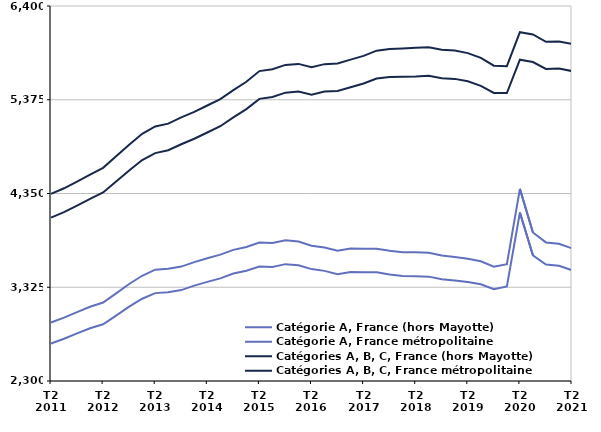
| Category | Catégorie A, France (hors Mayotte) | Catégorie A, France métropolitaine | Catégories A, B, C, France (hors Mayotte) | Catégories A, B, C, France métropolitaine |
|---|---|---|---|---|
| T2
2011 | 2939 | 2710.3 | 4345.1 | 4086.7 |
| T3
2011 | 2992.2 | 2761.8 | 4407 | 4146.5 |
| T4
2011 | 3053.8 | 2821.4 | 4480.5 | 4217.6 |
| T1
2012 | 3111.4 | 2876.4 | 4556.5 | 4290.3 |
| T2
2012 | 3158.4 | 2920.8 | 4630.7 | 4360.7 |
| T3
2012 | 3257.4 | 3015.3 | 4756.3 | 4480.8 |
| T4
2012 | 3360.9 | 3113 | 4883 | 4600.9 |
| T1
2013 | 3450.6 | 3199.2 | 5002.2 | 4716.3 |
| T2
2013 | 3516.7 | 3260.9 | 5082.7 | 4791.9 |
| T3
2013 | 3526.2 | 3270.1 | 5114 | 4822.9 |
| T4
2013 | 3550.8 | 3293.8 | 5181.5 | 4888.7 |
| T1
2014 | 3599.5 | 3343 | 5242 | 4948.8 |
| T2
2014 | 3641.9 | 3383.7 | 5312.3 | 5017.1 |
| T3
2014 | 3681.3 | 3422.1 | 5382.6 | 5085.7 |
| T4
2014 | 3734 | 3474.8 | 5480.7 | 5182.8 |
| T1
2015 | 3766 | 3506.1 | 5571.7 | 5272.2 |
| T2
2015 | 3812.9 | 3550.5 | 5688.4 | 5384.8 |
| T3
2015 | 3808.8 | 3546.7 | 5709 | 5404.8 |
| T4
2015 | 3838.1 | 3577.7 | 5755.8 | 5452.5 |
| T1
2016 | 3825.3 | 3565.5 | 5767.1 | 5464 |
| T2
2016 | 3779.3 | 3523.3 | 5730 | 5430.7 |
| T3
2016 | 3759.7 | 3504 | 5764.3 | 5464.3 |
| T4
2016 | 3724.6 | 3468.4 | 5771.7 | 5470.4 |
| T1
2017 | 3749.2 | 3492.3 | 5813.4 | 5511.3 |
| T2
2017 | 3744.8 | 3488.6 | 5855.1 | 5552.5 |
| T3
2017 | 3746.9 | 3489.6 | 5911.8 | 5606.6 |
| T4
2017 | 3723 | 3464 | 5931 | 5622.8 |
| T1
2018 | 3708.6 | 3448.7 | 5936.5 | 5626.6 |
| T2
2018 | 3706.6 | 3445.4 | 5942.3 | 5629.4 |
| T3
2018 | 3702 | 3441.1 | 5949.2 | 5636.1 |
| T4
2018 | 3671.2 | 3412.7 | 5922.2 | 5610.7 |
| T1
2019 | 3654.9 | 3397.5 | 5914.3 | 5603.1 |
| T2
2019 | 3636.3 | 3381.2 | 5884.6 | 5576.3 |
| T3
2019 | 3609.2 | 3357.3 | 5832.2 | 5527.4 |
| T4
2019 | 3549.3 | 3303.9 | 5747.1 | 5449.2 |
| T1
2020 | 3576.6 | 3334.2 | 5742 | 5448.2 |
| T2
2020 | 4400.8 | 4142.7 | 6113.9 | 5813.3 |
| T3
2020 | 3923.9 | 3673.2 | 6089.3 | 5787.1 |
| T4
2020 | 3815.2 | 3572.8 | 6008.4 | 5712.2 |
| T1
2021 | 3800.7 | 3560.6 | 6012.6 | 5716.9 |
| T2
2021 | 3750.1 | 3510.5 | 5984 | 5688.7 |